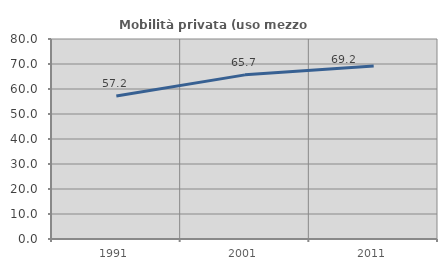
| Category | Mobilità privata (uso mezzo privato) |
|---|---|
| 1991.0 | 57.234 |
| 2001.0 | 65.656 |
| 2011.0 | 69.196 |